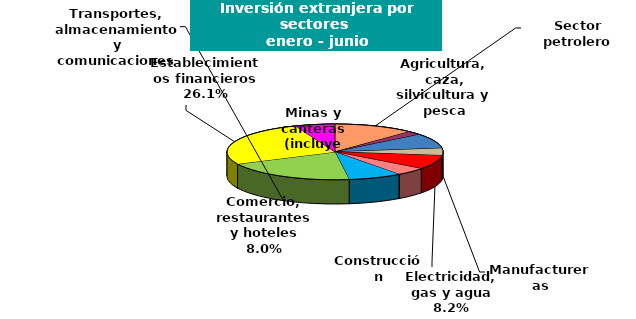
| Category | Series 0 |
|---|---|
| Sector petrolero | 554.682 |
| Agricultura, caza, silvicultura y pesca | 99.628 |
| Minas y canteras (incluye carbón) | 393.929 |
| Manufactureras | 192.013 |
| Electricidad, gas y agua | 374.085 |
| Construcción | 211.917 |
| Comercio, restaurantes y hoteles | 366.009 |
| Transportes, almacenamiento y comunicaciones | 915.12 |
| Establecimientos financieros | 1195.34 |
| Servicios comunales | 272.884 |